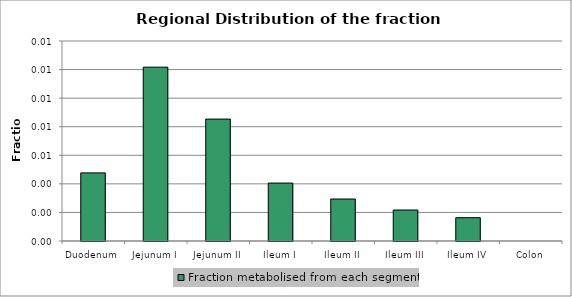
| Category | Fraction metabolised from each segment |
|---|---|
| Duodenum | 0.005 |
| Jejunum I | 0.012 |
| Jejunum II | 0.009 |
| Ileum I | 0.004 |
| Ileum II | 0.003 |
| Ileum III | 0.002 |
| Ileum IV | 0.002 |
| Colon | 0 |